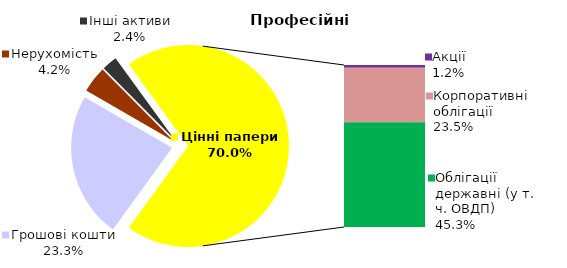
| Category | Професійні |
|---|---|
| Грошові кошти | 38.62 |
| Банківські метали | 0 |
| Нерухомість | 7.006 |
| Інші активи | 4.051 |
| Акції | 2.035 |
| Корпоративні облігації | 38.843 |
| Облігації місцевих рад | 0 |
| Облігації державні (у т. ч. ОВДП) | 74.865 |